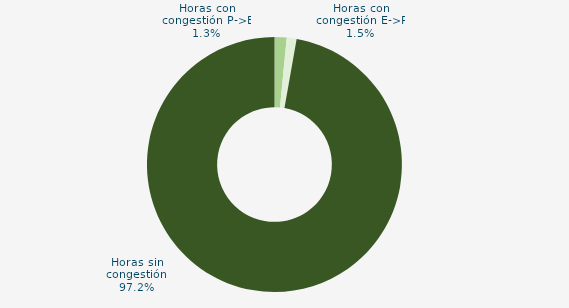
| Category | Horas con congestión E->P |
|---|---|
| Horas con congestión E->P | 1.528 |
| Horas con congestión P->E | 1.25 |
| Horas sin congestión | 97.222 |